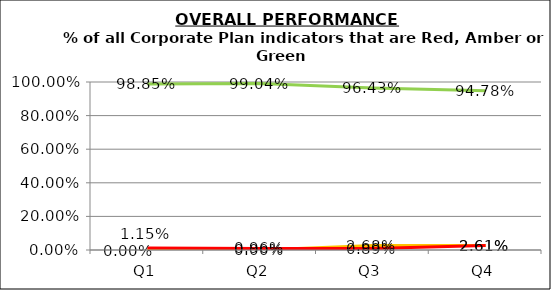
| Category | Green | Amber | Red |
|---|---|---|---|
| Q1 | 0.989 | 0 | 0.011 |
| Q2 | 0.99 | 0 | 0.01 |
| Q3 | 0.964 | 0.027 | 0.009 |
| Q4 | 0.948 | 0.026 | 0.026 |